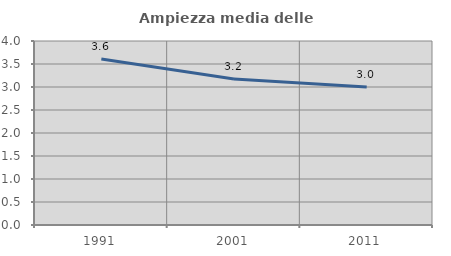
| Category | Ampiezza media delle famiglie |
|---|---|
| 1991.0 | 3.611 |
| 2001.0 | 3.172 |
| 2011.0 | 2.999 |